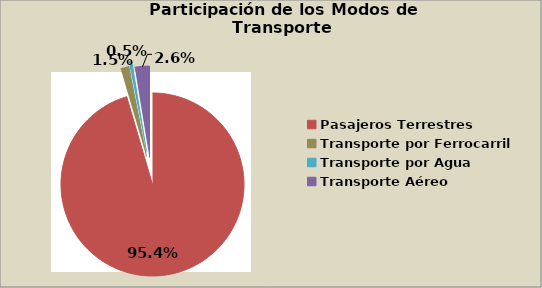
| Category | Series 0 |
|---|---|
| Pasajeros Terrestres | 95.447 |
| Transporte por Ferrocarril | 1.464 |
| Transporte por Agua | 0.507 |
| Transporte Aéreo | 2.581 |